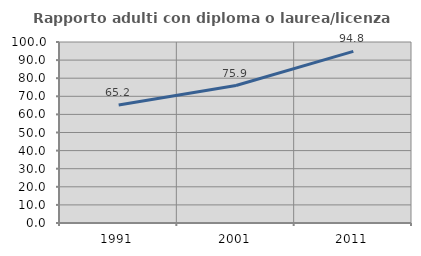
| Category | Rapporto adulti con diploma o laurea/licenza media  |
|---|---|
| 1991.0 | 65.152 |
| 2001.0 | 75.949 |
| 2011.0 | 94.845 |